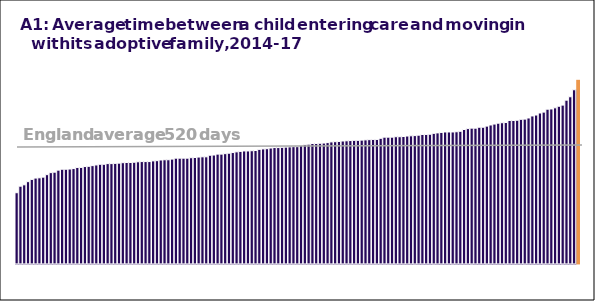
| Category | 0 | N/A |
|---|---|---|
| 0 | 0 | 313 |
| 1 | 0 | 342 |
| 2 | 0 | 348 |
| 3 | 0 | 362 |
| 4 | 0 | 372 |
| 5 | 0 | 378 |
| 6 | 0 | 379 |
| 7 | 0 | 382 |
| 8 | 0 | 393 |
| 9 | 0 | 402 |
| 10 | 0 | 404 |
| 11 | 0 | 413 |
| 12 | 0 | 417 |
| 13 | 0 | 417 |
| 14 | 0 | 418 |
| 15 | 0 | 420 |
| 16 | 0 | 425 |
| 17 | 0 | 425 |
| 18 | 0 | 429 |
| 19 | 0 | 430 |
| 20 | 0 | 433 |
| 21 | 0 | 436 |
| 22 | 0 | 439 |
| 23 | 0 | 439 |
| 24 | 0 | 442 |
| 25 | 0 | 442 |
| 26 | 0 | 443 |
| 27 | 0 | 444 |
| 28 | 0 | 446 |
| 29 | 0 | 447 |
| 30 | 0 | 447 |
| 31 | 0 | 448 |
| 32 | 0 | 450 |
| 33 | 0 | 451 |
| 34 | 0 | 451 |
| 35 | 0 | 451 |
| 36 | 0 | 454 |
| 37 | 0 | 455 |
| 38 | 0 | 458 |
| 39 | 0 | 459 |
| 40 | 0 | 459 |
| 41 | 0 | 462 |
| 42 | 0 | 466 |
| 43 | 0 | 466 |
| 44 | 0 | 466 |
| 45 | 0 | 466 |
| 46 | 0 | 468 |
| 47 | 0 | 469 |
| 48 | 0 | 471 |
| 49 | 0 | 472 |
| 50 | 0 | 472 |
| 51 | 0 | 479 |
| 52 | 0 | 480 |
| 53 | 0 | 484 |
| 54 | 0 | 484 |
| 55 | 0 | 486 |
| 56 | 0 | 488 |
| 57 | 0 | 491 |
| 58 | 0 | 494 |
| 59 | 0 | 496 |
| 60 | 0 | 498 |
| 61 | 0 | 498 |
| 62 | 0 | 499 |
| 63 | 0 | 500 |
| 64 | 0 | 505 |
| 65 | 0 | 507 |
| 66 | 0 | 508 |
| 67 | 0 | 511 |
| 68 | 0 | 513 |
| 69 | 0 | 513 |
| 70 | 0 | 514 |
| 71 | 0 | 515 |
| 72 | 0 | 516 |
| 73 | 0 | 517 |
| 74 | 0 | 517 |
| 75 | 0 | 522 |
| 76 | 0 | 526 |
| 77 | 0 | 528 |
| 78 | 0 | 531 |
| 79 | 0 | 531 |
| 80 | 0 | 532 |
| 81 | 0 | 533 |
| 82 | 0 | 535 |
| 83 | 0 | 538 |
| 84 | 0 | 539 |
| 85 | 0 | 540 |
| 86 | 0 | 542 |
| 87 | 0 | 543 |
| 88 | 0 | 544 |
| 89 | 0 | 545 |
| 90 | 0 | 545 |
| 91 | 0 | 546 |
| 92 | 0 | 547 |
| 93 | 0 | 548 |
| 94 | 0 | 549 |
| 95 | 0 | 549 |
| 96 | 0 | 554 |
| 97 | 0 | 559 |
| 98 | 0 | 559 |
| 99 | 0 | 559 |
| 100 | 0 | 561 |
| 101 | 0 | 561 |
| 102 | 0 | 562 |
| 103 | 0 | 564 |
| 104 | 0 | 565 |
| 105 | 0 | 566 |
| 106 | 0 | 568 |
| 107 | 0 | 571 |
| 108 | 0 | 571 |
| 109 | 0 | 572 |
| 110 | 0 | 576 |
| 111 | 0 | 578 |
| 112 | 0 | 580 |
| 113 | 0 | 582 |
| 114 | 0 | 582 |
| 115 | 0 | 582 |
| 116 | 0 | 583 |
| 117 | 0 | 585 |
| 118 | 0 | 593 |
| 119 | 0 | 597 |
| 120 | 0 | 599 |
| 121 | 0 | 599 |
| 122 | 0 | 603 |
| 123 | 0 | 603 |
| 124 | 0 | 608 |
| 125 | 0 | 613 |
| 126 | 0 | 617 |
| 127 | 0 | 621 |
| 128 | 0 | 623 |
| 129 | 0 | 624 |
| 130 | 0 | 633 |
| 131 | 0 | 633 |
| 132 | 0 | 634 |
| 133 | 0 | 638 |
| 134 | 0 | 639 |
| 135 | 0 | 644 |
| 136 | 0 | 653 |
| 137 | 0 | 657 |
| 138 | 0 | 666 |
| 139 | 0 | 670 |
| 140 | 0 | 683 |
| 141 | 0 | 684 |
| 142 | 0 | 689 |
| 143 | 0 | 696 |
| 144 | 0 | 701 |
| 145 | 0 | 723 |
| 146 | 0 | 738 |
| 147 | 0 | 769 |
| 148 | 813 | 0 |